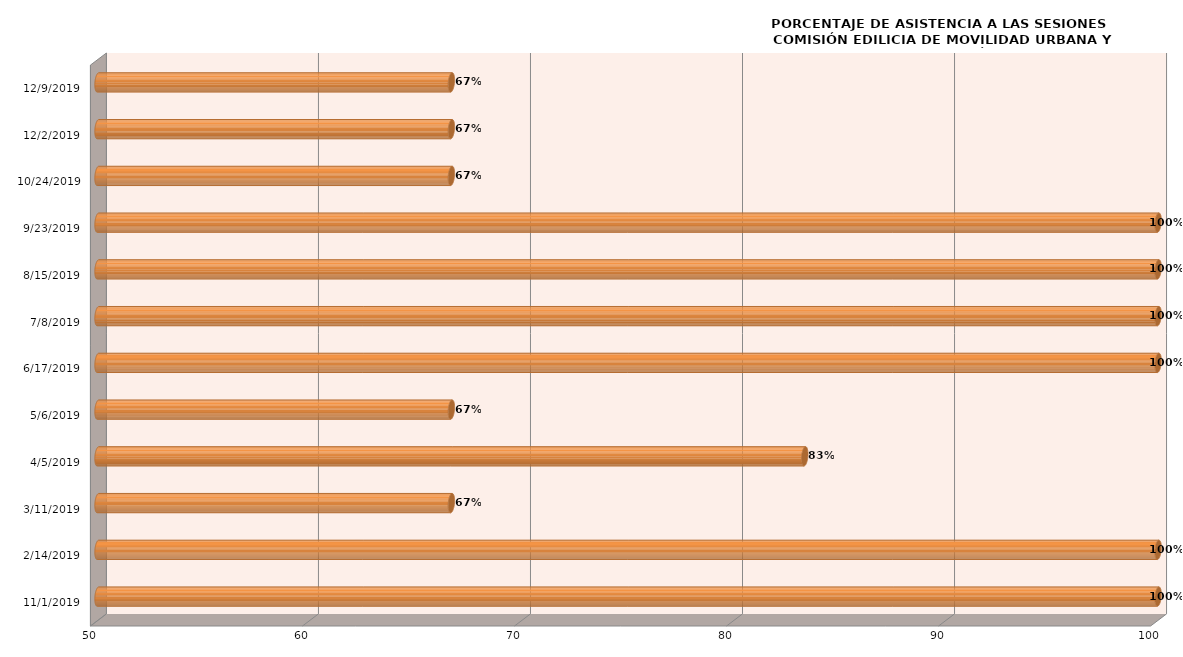
| Category | Series 0 |
|---|---|
| 11/1/19 | 100 |
| 2/14/19 | 100 |
| 3/11/19 | 66.667 |
| 4/5/19 | 83.333 |
| 5/6/19 | 66.667 |
| 6/17/19 | 100 |
| 7/8/19 | 100 |
| 8/15/19 | 100 |
| 9/23/19 | 100 |
| 10/24/19 | 66.667 |
| 12/2/19 | 66.667 |
| 12/9/19 | 66.667 |